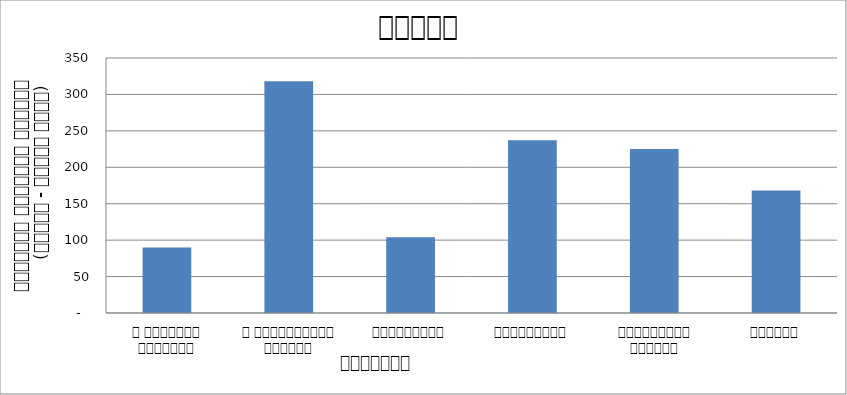
| Category | Total |
|---|---|
| द हिमालयन टाइम्स् | 90 |
| द काठमाण्डौं पोस्ट् | 318 |
| रिपब्लिका | 104 |
| कान्तिपुर | 237 |
| अन्नपूर्ण पोस्ट् | 225 |
| नागरिक | 168 |